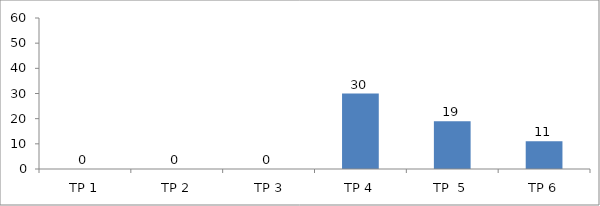
| Category | BIL. MURID |
|---|---|
| TP 1 | 0 |
| TP 2 | 0 |
|  TP 3 | 0 |
| TP 4 | 30 |
| TP  5 | 19 |
| TP 6 | 11 |